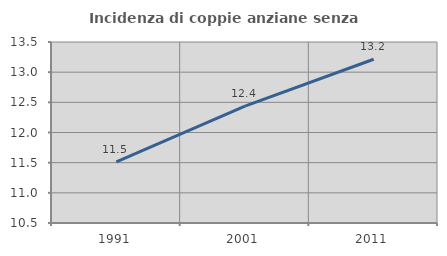
| Category | Incidenza di coppie anziane senza figli  |
|---|---|
| 1991.0 | 11.513 |
| 2001.0 | 12.439 |
| 2011.0 | 13.214 |